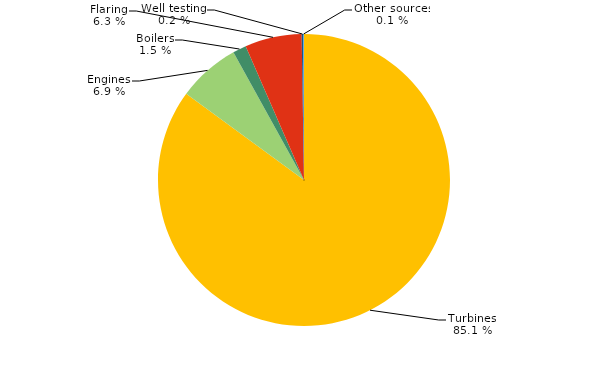
| Category | Series 0 |
|---|---|
| Turbines | 10.895 |
| Engines | 0.884 |
| Boilers | 0.191 |
| Flaring | 0.805 |
| Well testing | 0.022 |
| Other sources | 0.011 |